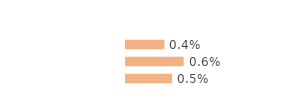
| Category | Series 0 |
|---|---|
| Immigrées | 0.004 |
| Descendantes d'immigré(s) | 0.006 |
| Ni immigrées, ni descendantes | 0.005 |